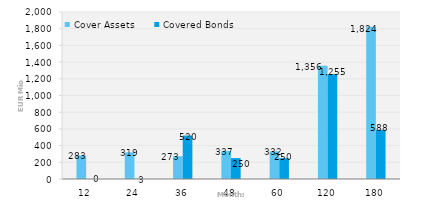
| Category | Cover Assets | Covered Bonds |
|---|---|---|
| 12.0 | 283 | 0 |
| 24.0 | 319 | 3 |
| 36.0 | 273 | 520 |
| 48.0 | 337 | 250 |
| 60.0 | 332 | 250 |
| 120.0 | 1356 | 1255 |
| 180.0 | 1824 | 588 |